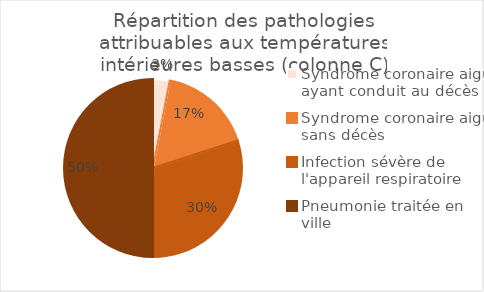
| Category | Series 0 |
|---|---|
| Syndrome coronaire aigu ayant conduit au décès | 0.03 |
| Syndrome coronaire aigu sans décès | 0.17 |
| Infection sévère de l'appareil respiratoire | 0.3 |
| Pneumonie traitée en ville | 0.5 |